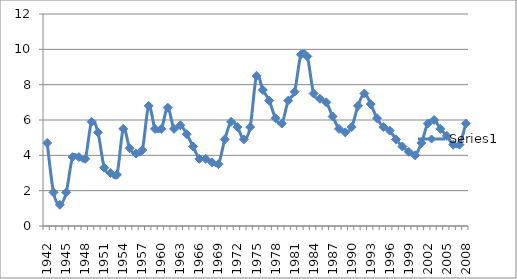
| Category | Series 0 |
|---|---|
| 1942.0 | 4.7 |
| 1943.0 | 1.9 |
| 1944.0 | 1.2 |
| 1945.0 | 1.9 |
| 1946.0 | 3.9 |
| 1947.0 | 3.9 |
| 1948.0 | 3.8 |
| 1949.0 | 5.9 |
| 1950.0 | 5.3 |
| 1951.0 | 3.3 |
| 1952.0 | 3 |
| 1953.0 | 2.9 |
| 1954.0 | 5.5 |
| 1955.0 | 4.4 |
| 1956.0 | 4.1 |
| 1957.0 | 4.3 |
| 1958.0 | 6.8 |
| 1959.0 | 5.5 |
| 1960.0 | 5.5 |
| 1961.0 | 6.7 |
| 1962.0 | 5.5 |
| 1963.0 | 5.7 |
| 1964.0 | 5.2 |
| 1965.0 | 4.5 |
| 1966.0 | 3.8 |
| 1967.0 | 3.8 |
| 1968.0 | 3.6 |
| 1969.0 | 3.5 |
| 1970.0 | 4.9 |
| 1971.0 | 5.9 |
| 1972.0 | 5.6 |
| 1973.0 | 4.9 |
| 1974.0 | 5.6 |
| 1975.0 | 8.5 |
| 1976.0 | 7.7 |
| 1977.0 | 7.1 |
| 1978.0 | 6.1 |
| 1979.0 | 5.8 |
| 1980.0 | 7.1 |
| 1981.0 | 7.6 |
| 1982.0 | 9.7 |
| 1983.0 | 9.6 |
| 1984.0 | 7.5 |
| 1985.0 | 7.2 |
| 1986.0 | 7 |
| 1987.0 | 6.2 |
| 1988.0 | 5.5 |
| 1989.0 | 5.3 |
| 1990.0 | 5.6 |
| 1991.0 | 6.8 |
| 1992.0 | 7.5 |
| 1993.0 | 6.9 |
| 1994.0 | 6.1 |
| 1995.0 | 5.6 |
| 1996.0 | 5.4 |
| 1997.0 | 4.9 |
| 1998.0 | 4.5 |
| 1999.0 | 4.2 |
| 2000.0 | 4 |
| 2001.0 | 4.7 |
| 2002.0 | 5.8 |
| 2003.0 | 6 |
| 2004.0 | 5.5 |
| 2005.0 | 5.1 |
| 2006.0 | 4.6 |
| 2007.0 | 4.6 |
| 2008.0 | 5.8 |